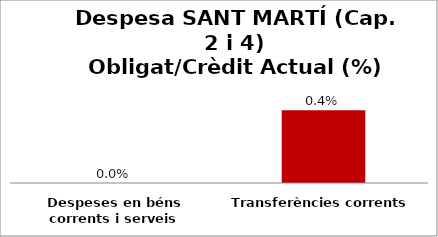
| Category | Series 0 |
|---|---|
| Despeses en béns corrents i serveis | 0 |
| Transferències corrents | 0.004 |